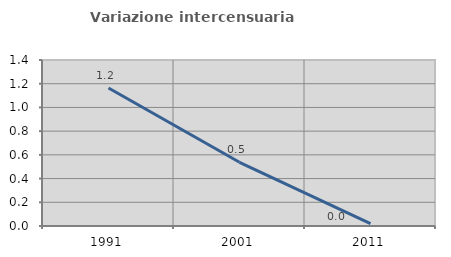
| Category | Variazione intercensuaria annua |
|---|---|
| 1991.0 | 1.164 |
| 2001.0 | 0.537 |
| 2011.0 | 0.019 |